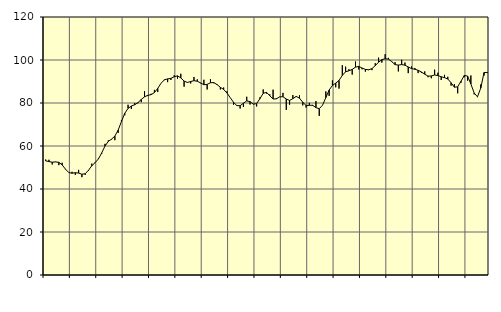
| Category | Piggar | Series 1 |
|---|---|---|
| nan | 53.7 | 53.11 |
| 87.0 | 53.6 | 52.75 |
| 87.0 | 51.4 | 52.47 |
| 87.0 | 52.7 | 52.59 |
| nan | 51.1 | 52.42 |
| 88.0 | 52.2 | 51.21 |
| 88.0 | 49.1 | 49.26 |
| 88.0 | 47.6 | 47.66 |
| nan | 48 | 47.34 |
| 89.0 | 46.6 | 47.58 |
| 89.0 | 48.9 | 47.41 |
| 89.0 | 45.5 | 46.87 |
| nan | 46.6 | 47.09 |
| 90.0 | 48.5 | 48.74 |
| 90.0 | 51.8 | 50.79 |
| 90.0 | 52.1 | 52.25 |
| nan | 54.1 | 53.95 |
| 91.0 | 56.3 | 56.77 |
| 91.0 | 61 | 59.95 |
| 91.0 | 62.6 | 62.14 |
| nan | 63 | 63.2 |
| 92.0 | 62.7 | 64.6 |
| 92.0 | 66.1 | 67.39 |
| 92.0 | 72.1 | 71.39 |
| nan | 74.3 | 75.21 |
| 93.0 | 79.2 | 77.5 |
| 93.0 | 77.2 | 78.6 |
| 93.0 | 80 | 79.16 |
| nan | 79.9 | 80.17 |
| 94.0 | 80.4 | 81.65 |
| 94.0 | 85.5 | 82.88 |
| 94.0 | 83.2 | 83.59 |
| nan | 84.3 | 83.87 |
| 95.0 | 86.1 | 84.85 |
| 95.0 | 85.1 | 86.79 |
| 95.0 | 89.2 | 89.17 |
| nan | 90.9 | 90.75 |
| 96.0 | 89.7 | 91.22 |
| 96.0 | 90.7 | 91.46 |
| 96.0 | 92.9 | 92.21 |
| nan | 91.3 | 92.62 |
| 97.0 | 93.6 | 91.69 |
| 97.0 | 87.6 | 90.2 |
| 97.0 | 89.7 | 89.55 |
| nan | 89.1 | 90 |
| 98.0 | 92.1 | 90.39 |
| 98.0 | 91 | 90.12 |
| 98.0 | 89.2 | 89.36 |
| nan | 90.8 | 88.49 |
| 99.0 | 86.3 | 88.67 |
| 99.0 | 91.1 | 89.41 |
| 99.0 | 89.2 | 89.5 |
| nan | 88.4 | 88.58 |
| 0.0 | 86.3 | 87.29 |
| 0.0 | 87.2 | 86.32 |
| 0.0 | 85.4 | 84.65 |
| nan | 82.5 | 82.47 |
| 1.0 | 79.2 | 80.34 |
| 1.0 | 79 | 78.79 |
| 1.0 | 77.4 | 78.75 |
| nan | 78.2 | 79.91 |
| 2.0 | 82.9 | 80.96 |
| 2.0 | 79.3 | 80.65 |
| 2.0 | 79.6 | 79.46 |
| nan | 78.4 | 79.72 |
| 3.0 | 82.6 | 82.02 |
| 3.0 | 86.3 | 84.48 |
| 3.0 | 84.4 | 84.96 |
| nan | 84 | 83.35 |
| 4.0 | 86.2 | 81.86 |
| 4.0 | 82.2 | 81.92 |
| 4.0 | 82.8 | 82.87 |
| nan | 84.7 | 82.92 |
| 5.0 | 76.8 | 81.85 |
| 5.0 | 79.2 | 81.19 |
| 5.0 | 83.7 | 82.03 |
| nan | 82.8 | 83.04 |
| 6.0 | 83.6 | 82.28 |
| 6.0 | 78.9 | 80.36 |
| 6.0 | 77.9 | 78.85 |
| nan | 80.1 | 78.91 |
| 7.0 | 78.7 | 78.96 |
| 7.0 | 80.9 | 77.83 |
| 7.0 | 74 | 77.37 |
| nan | 79 | 78.97 |
| 8.0 | 85.4 | 82.52 |
| 8.0 | 83.3 | 86.02 |
| 8.0 | 90.5 | 88.16 |
| nan | 87.3 | 89.24 |
| 9.0 | 86.7 | 90.51 |
| 9.0 | 97.6 | 92.83 |
| 9.0 | 96.9 | 94.53 |
| nan | 95.7 | 94.96 |
| 10.0 | 93.2 | 95.63 |
| 10.0 | 99.3 | 96.68 |
| 10.0 | 95.6 | 97.03 |
| nan | 95.7 | 96.26 |
| 11.0 | 94.6 | 95.62 |
| 11.0 | 95.3 | 95.45 |
| 11.0 | 95.3 | 95.99 |
| nan | 98.5 | 97.42 |
| 12.0 | 101.1 | 98.94 |
| 12.0 | 98.8 | 100.16 |
| 12.0 | 102.7 | 100.58 |
| nan | 101 | 100.41 |
| 13.0 | 99.1 | 99.25 |
| 13.0 | 99 | 97.86 |
| 13.0 | 94.7 | 97.64 |
| nan | 100.1 | 97.86 |
| 14.0 | 98.8 | 97.59 |
| 14.0 | 93.9 | 96.76 |
| 14.0 | 97 | 96 |
| nan | 96.3 | 95.7 |
| 15.0 | 93.9 | 95.22 |
| 15.0 | 94 | 94.41 |
| 15.0 | 94.7 | 93.41 |
| nan | 92 | 92.48 |
| 16.0 | 91.5 | 92.58 |
| 16.0 | 95.5 | 93.03 |
| 16.0 | 94.1 | 92.76 |
| nan | 90.7 | 92.19 |
| 17.0 | 93.1 | 91.79 |
| 17.0 | 92.2 | 91.17 |
| 17.0 | 88.1 | 89.4 |
| nan | 88.8 | 87.34 |
| 18.0 | 84.5 | 87.54 |
| 18.0 | 89.4 | 90.1 |
| 18.0 | 92 | 92.79 |
| nan | 90.4 | 92.55 |
| 19.0 | 92.8 | 88.84 |
| 19.0 | 84 | 84.66 |
| 19.0 | 82.7 | 82.88 |
| nan | 88.6 | 86.95 |
| 20.0 | 92.8 | 94.17 |
| 20.0 | 93.9 | 94.22 |